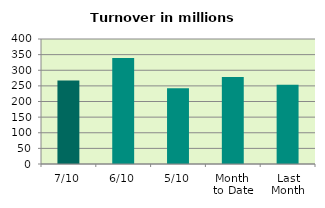
| Category | Series 0 |
|---|---|
| 7/10 | 267.353 |
| 6/10 | 339.13 |
| 5/10 | 242.426 |
| Month 
to Date | 278.624 |
| Last
Month | 253.961 |